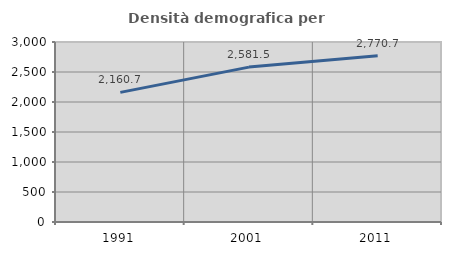
| Category | Densità demografica |
|---|---|
| 1991.0 | 2160.74 |
| 2001.0 | 2581.486 |
| 2011.0 | 2770.666 |